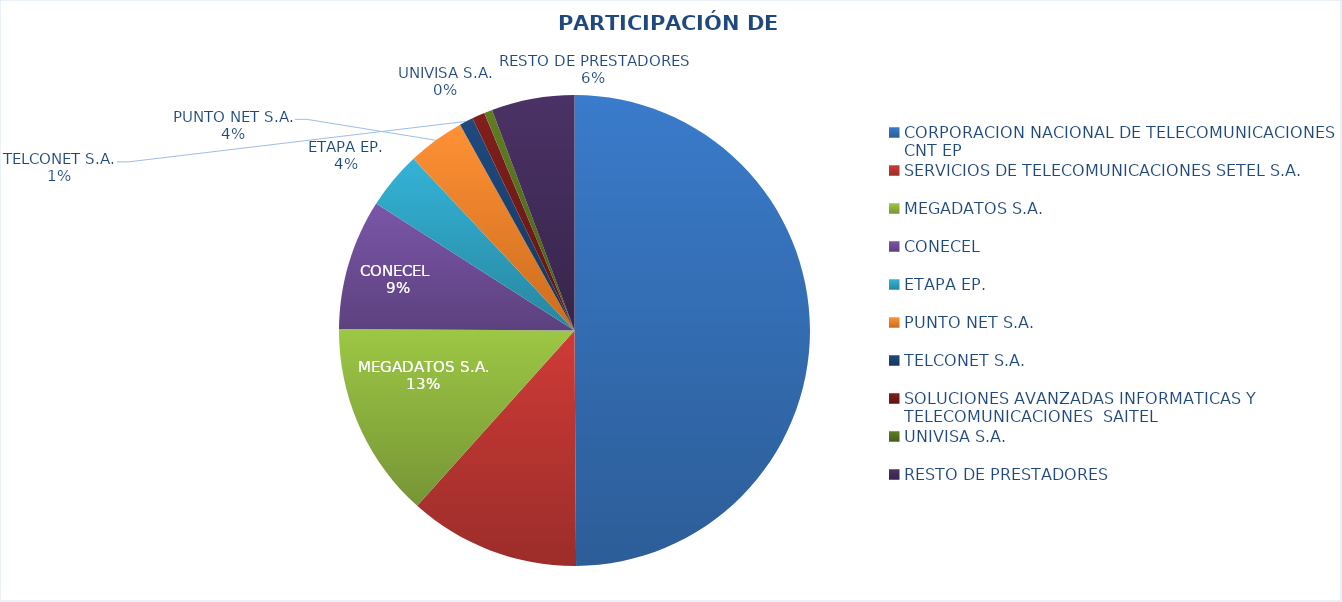
| Category | PARTICIPACIÓN DE MERCADO |
|---|---|
| CORPORACION NACIONAL DE TELECOMUNICACIONES CNT EP | 0.499 |
| SERVICIOS DE TELECOMUNICACIONES SETEL S.A. | 0.117 |
| MEGADATOS S.A. | 0.135 |
| CONECEL  | 0.09 |
| ETAPA EP. | 0.04 |
| PUNTO NET S.A. | 0.039 |
| TELCONET S.A. | 0.009 |
| SOLUCIONES AVANZADAS INFORMATICAS Y TELECOMUNICACIONES  SAITEL | 0.009 |
| UNIVISA S.A. | 0.006 |
| RESTO DE PRESTADORES | 0.057 |